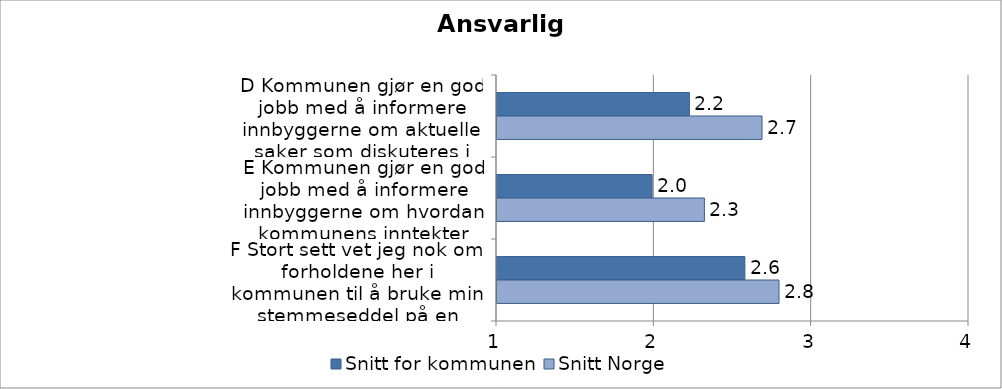
| Category | Snitt for kommunen | Snitt Norge |
|---|---|---|
| D Kommunen gjør en god jobb med å informere innbyggerne om aktuelle saker som diskuteres i kommunepolitikken | 2.223 | 2.684 |
| E Kommunen gjør en god jobb med å informere innbyggerne om hvordan kommunens inntekter brukes | 1.986 | 2.318 |
| F Stort sett vet jeg nok om forholdene her i kommunen til å bruke min stemmeseddel på en fornuftig måte i kommunevalget | 2.575 | 2.792 |